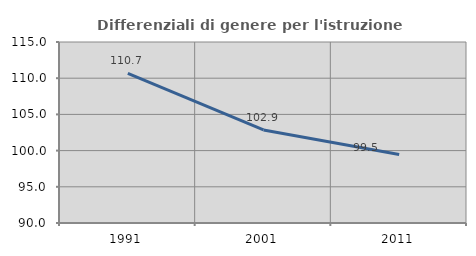
| Category | Differenziali di genere per l'istruzione superiore |
|---|---|
| 1991.0 | 110.674 |
| 2001.0 | 102.852 |
| 2011.0 | 99.454 |